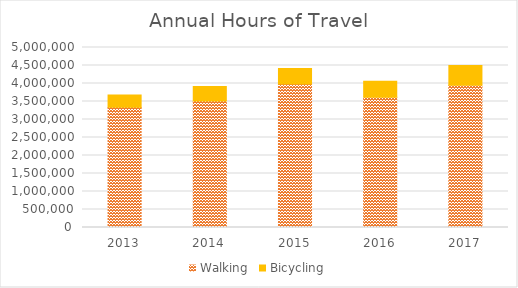
| Category | Walking | Bicycling |
|---|---|---|
| 2013 | 3338066.387 | 344770.249 |
| 2014 | 3515418.124 | 401900.323 |
| 2015 | 3989042.22 | 428028.752 |
| 2016 | 3619498.967 | 442614.428 |
| 2017 | 3948366.936 | 554334.767 |